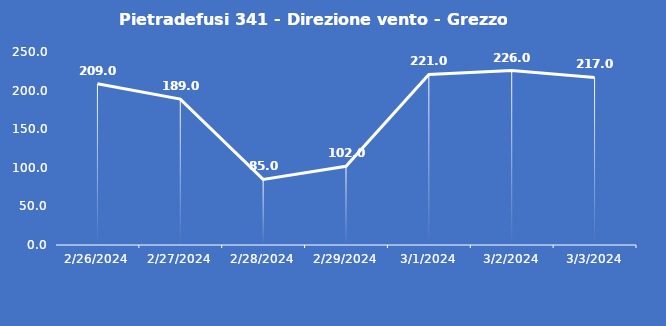
| Category | Pietradefusi 341 - Direzione vento - Grezzo (°N) |
|---|---|
| 2/26/24 | 209 |
| 2/27/24 | 189 |
| 2/28/24 | 85 |
| 2/29/24 | 102 |
| 3/1/24 | 221 |
| 3/2/24 | 226 |
| 3/3/24 | 217 |